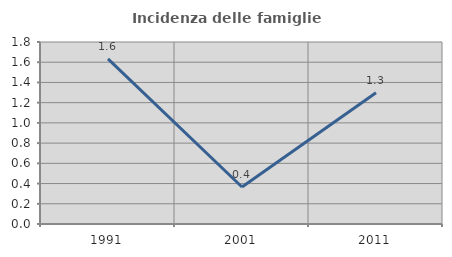
| Category | Incidenza delle famiglie numerose |
|---|---|
| 1991.0 | 1.633 |
| 2001.0 | 0.366 |
| 2011.0 | 1.299 |